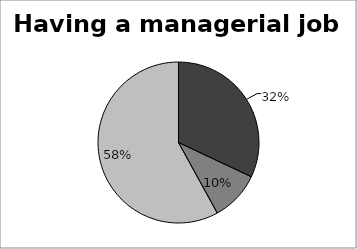
| Category | Having a managerial job |
|---|---|
| 0 | 0.32 |
| 1 | 0.1 |
| 2 | 0.58 |